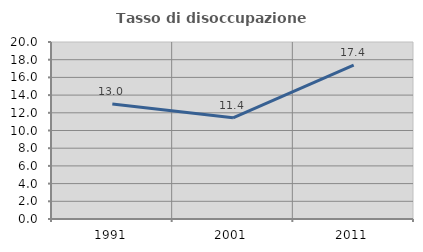
| Category | Tasso di disoccupazione giovanile  |
|---|---|
| 1991.0 | 13.007 |
| 2001.0 | 11.429 |
| 2011.0 | 17.378 |